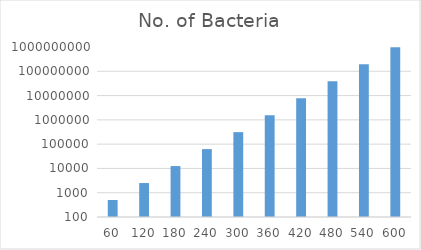
| Category | No. of Bacteria |
|---|---|
| 60.0 | 500 |
| 120.0 | 2500 |
| 180.0 | 12500 |
| 240.0 | 62500 |
| 300.0 | 312500 |
| 360.0 | 1562500 |
| 420.0 | 7812500 |
| 480.0 | 39062500 |
| 540.0 | 195312500 |
| 600.0 | 976562500 |